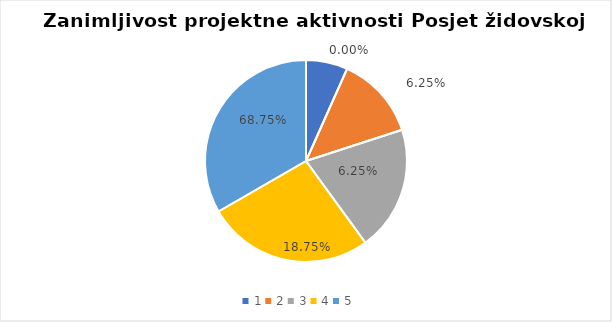
| Category | Series 0 | Series 1 |
|---|---|---|
| 0 | 1 | 0 |
| 1 | 2 | 0.062 |
| 2 | 3 | 0.062 |
| 3 | 4 | 0.188 |
| 4 | 5 | 0.688 |